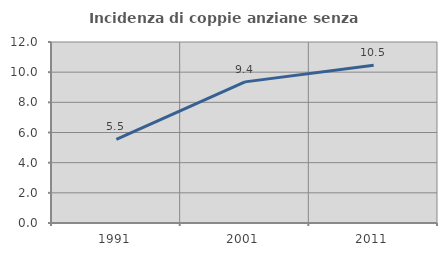
| Category | Incidenza di coppie anziane senza figli  |
|---|---|
| 1991.0 | 5.537 |
| 2001.0 | 9.357 |
| 2011.0 | 10.462 |